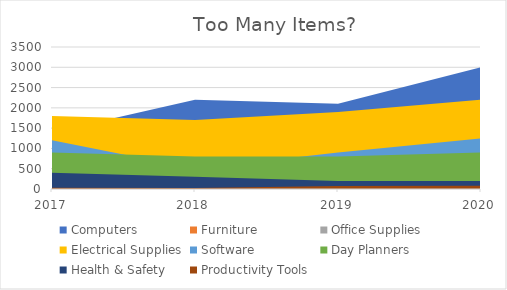
| Category | Computers | Furniture | Office Supplies | Electrical Supplies | Software | Day Planners | Health & Safety | Productivity Tools |
|---|---|---|---|---|---|---|---|---|
| 2017.0 | 1400 | 1200 | 300 | 1800 | 1200 | 900 | 400 | 32 |
| 2018.0 | 2200 | 1100 | 590 | 1700 | 500 | 800 | 300 | 25 |
| 2019.0 | 2100 | 500 | 125 | 1900 | 900 | 800 | 200 | 75 |
| 2020.0 | 3000 | 750 | 123 | 2200 | 1250 | 900 | 200 | 80 |